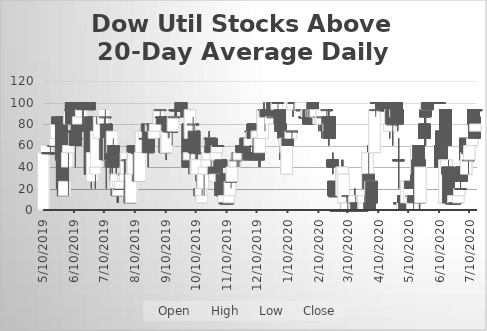
| Category | Open | High | Low | Close |
|---|---|---|---|---|
| 5/10/19 | 0.01 | 53.33 | 0.01 | 53.33 |
| 5/13/19 | 53.33 | 60 | 53.33 | 60 |
| 5/14/19 | 53.33 | 53.33 | 53.33 | 53.33 |
| 5/15/19 | 53.33 | 53.33 | 53.33 | 53.33 |
| 5/16/19 | 53.33 | 53.33 | 53.33 | 53.33 |
| 5/17/19 | 53.33 | 60 | 53.33 | 53.33 |
| 5/20/19 | 60 | 60 | 60 | 60 |
| 5/21/19 | 60 | 66.66 | 60 | 60 |
| 5/22/19 | 60 | 66.66 | 60 | 66.66 |
| 5/23/19 | 66.66 | 86.66 | 60 | 86.66 |
| 5/24/19 | 86.66 | 86.66 | 80 | 80 |
| 5/28/19 | 86.66 | 86.66 | 46.66 | 46.66 |
| 5/29/19 | 46.66 | 46.66 | 13.33 | 20 |
| 5/30/19 | 20 | 26.66 | 13.33 | 13.33 |
| 5/31/19 | 13.33 | 33.33 | 13.33 | 26.66 |
| 6/3/19 | 40 | 53.33 | 26.66 | 53.33 |
| 6/4/19 | 53.33 | 60 | 13.33 | 60 |
| 6/5/19 | 80 | 93.33 | 80 | 93.33 |
| 6/6/19 | 93.33 | 100 | 93.33 | 93.33 |
| 6/7/19 | 100 | 100 | 80 | 80 |
| 6/10/19 | 73.33 | 73.33 | 66.66 | 73.33 |
| 6/11/19 | 73.33 | 73.33 | 40 | 60 |
| 6/12/19 | 66.66 | 73.33 | 60 | 66.66 |
| 6/13/19 | 80 | 80 | 60 | 73.33 |
| 6/14/19 | 80 | 86.66 | 80 | 86.66 |
| 6/17/19 | 86.66 | 93.33 | 86.66 | 93.33 |
| 6/18/19 | 100 | 100 | 73.33 | 93.33 |
| 6/19/19 | 100 | 100 | 73.33 | 100 |
| 6/20/19 | 100 | 100 | 100 | 100 |
| 6/21/19 | 100 | 100 | 100 | 100 |
| 6/24/19 | 100 | 100 | 93.33 | 100 |
| 6/25/19 | 100 | 100 | 93.33 | 93.33 |
| 6/26/19 | 86.66 | 86.66 | 33.33 | 33.33 |
| 6/27/19 | 46.66 | 46.66 | 20 | 33.33 |
| 6/28/19 | 26.66 | 53.33 | 26.66 | 53.33 |
| 7/1/19 | 33.33 | 40 | 20 | 40 |
| 7/2/19 | 40 | 73.33 | 40 | 73.33 |
| 7/3/19 | 86.66 | 86.66 | 80 | 86.66 |
| 7/5/19 | 66.66 | 86.66 | 46.66 | 86.66 |
| 7/8/19 | 86.66 | 86.66 | 60 | 80 |
| 7/9/19 | 80 | 86.66 | 66.66 | 86.66 |
| 7/10/19 | 86.66 | 93.33 | 80 | 93.33 |
| 7/11/19 | 86.66 | 93.33 | 40 | 86.66 |
| 7/12/19 | 80 | 80 | 20 | 46.66 |
| 7/15/19 | 46.66 | 73.33 | 46.66 | 66.66 |
| 7/16/19 | 66.66 | 66.66 | 26.66 | 46.66 |
| 7/17/19 | 60 | 66.66 | 46.66 | 53.33 |
| 7/18/19 | 53.33 | 73.33 | 33.33 | 73.33 |
| 7/19/19 | 60 | 66.66 | 40 | 40 |
| 7/22/19 | 20 | 46.66 | 13.33 | 33.33 |
| 7/23/19 | 20 | 26.66 | 6.66 | 13.33 |
| 7/24/19 | 13.33 | 26.66 | 6.66 | 26.66 |
| 7/25/19 | 20 | 26.66 | 20 | 20 |
| 7/26/19 | 20 | 33.33 | 20 | 26.66 |
| 7/29/19 | 26.66 | 33.33 | 26.66 | 33.33 |
| 7/30/19 | 33.33 | 40 | 13.33 | 33.33 |
| 7/31/19 | 26.66 | 40 | 20 | 33.33 |
| 8/1/19 | 33.33 | 53.33 | 33.33 | 53.33 |
| 8/2/19 | 46.66 | 60 | 46.66 | 46.66 |
| 8/5/19 | 46.66 | 46.66 | 6.66 | 6.66 |
| 8/6/19 | 6.66 | 40 | 6.66 | 33.33 |
| 8/7/19 | 33.33 | 46.66 | 26.66 | 46.66 |
| 8/8/19 | 33.33 | 60 | 33.33 | 53.33 |
| 8/9/19 | 60 | 60 | 53.33 | 53.33 |
| 8/12/19 | 53.33 | 53.33 | 53.33 | 53.33 |
| 8/13/19 | 53.33 | 60 | 46.66 | 53.33 |
| 8/14/19 | 53.33 | 60 | 26.66 | 26.66 |
| 8/15/19 | 26.66 | 66.66 | 26.66 | 53.33 |
| 8/16/19 | 53.33 | 73.33 | 53.33 | 73.33 |
| 8/19/19 | 66.66 | 80 | 66.66 | 73.33 |
| 8/20/19 | 66.66 | 73.33 | 66.66 | 66.66 |
| 8/21/19 | 73.33 | 80 | 66.66 | 80 |
| 8/22/19 | 80 | 80 | 73.33 | 73.33 |
| 8/23/19 | 80 | 80 | 40 | 53.33 |
| 8/26/19 | 73.33 | 80 | 66.66 | 80 |
| 8/27/19 | 80 | 80 | 73.33 | 80 |
| 8/28/19 | 80 | 80 | 66.66 | 66.66 |
| 8/29/19 | 66.66 | 73.33 | 60 | 73.33 |
| 8/30/19 | 73.33 | 86.66 | 73.33 | 80 |
| 9/3/19 | 80 | 93.33 | 80 | 93.33 |
| 9/4/19 | 93.33 | 93.33 | 86.66 | 93.33 |
| 9/5/19 | 86.66 | 86.66 | 80 | 86.66 |
| 9/6/19 | 86.66 | 86.66 | 66.66 | 80 |
| 9/9/19 | 66.66 | 66.66 | 53.33 | 53.33 |
| 9/10/19 | 53.33 | 66.66 | 46.66 | 66.66 |
| 9/11/19 | 53.33 | 73.33 | 53.33 | 73.33 |
| 9/12/19 | 86.66 | 86.66 | 66.66 | 73.33 |
| 9/13/19 | 73.33 | 73.33 | 66.66 | 73.33 |
| 9/16/19 | 73.33 | 73.33 | 60 | 73.33 |
| 9/17/19 | 73.33 | 86.66 | 73.33 | 86.66 |
| 9/18/19 | 86.66 | 86.66 | 86.66 | 86.66 |
| 9/19/19 | 93.33 | 93.33 | 86.66 | 93.33 |
| 9/20/19 | 93.33 | 93.33 | 86.66 | 93.33 |
| 9/23/19 | 93.33 | 93.33 | 93.33 | 93.33 |
| 9/24/19 | 93.33 | 100 | 93.33 | 93.33 |
| 9/25/19 | 100 | 100 | 93.33 | 93.33 |
| 9/26/19 | 93.33 | 100 | 93.33 | 93.33 |
| 9/27/19 | 93.33 | 93.33 | 93.33 | 93.33 |
| 9/30/19 | 93.33 | 93.33 | 93.33 | 93.33 |
| 10/1/19 | 93.33 | 93.33 | 80 | 86.66 |
| 10/2/19 | 80 | 80 | 40 | 40 |
| 10/3/19 | 46.66 | 53.33 | 33.33 | 53.33 |
| 10/4/19 | 66.66 | 93.33 | 46.66 | 93.33 |
| 10/7/19 | 80 | 86.66 | 66.66 | 80 |
| 10/8/19 | 73.33 | 80 | 53.33 | 53.33 |
| 10/9/19 | 53.33 | 66.66 | 53.33 | 53.33 |
| 10/10/19 | 33.33 | 53.33 | 26.66 | 46.66 |
| 10/11/19 | 33.33 | 53.33 | 20 | 46.66 |
| 10/14/19 | 20 | 33.33 | 13.33 | 13.33 |
| 10/15/19 | 13.33 | 20 | 13.33 | 20 |
| 10/16/19 | 6.66 | 20 | 6.66 | 13.33 |
| 10/17/19 | 20 | 40 | 20 | 33.33 |
| 10/18/19 | 33.33 | 40 | 13.33 | 40 |
| 10/21/19 | 40 | 46.66 | 40 | 46.66 |
| 10/22/19 | 46.66 | 60 | 46.66 | 53.33 |
| 10/23/19 | 60 | 73.33 | 60 | 66.66 |
| 10/24/19 | 66.66 | 66.66 | 66.66 | 66.66 |
| 10/25/19 | 66.66 | 66.66 | 40 | 53.33 |
| 10/28/19 | 40 | 46.66 | 26.66 | 33.33 |
| 10/29/19 | 26.66 | 40 | 13.33 | 33.33 |
| 10/30/19 | 46.66 | 60 | 40 | 53.33 |
| 10/31/19 | 53.33 | 66.66 | 53.33 | 60 |
| 11/1/19 | 60 | 60 | 60 | 60 |
| 11/4/19 | 46.66 | 46.66 | 20 | 40 |
| 11/5/19 | 33.33 | 40 | 13.33 | 13.33 |
| 11/6/19 | 20 | 33.33 | 13.33 | 13.33 |
| 11/7/19 | 6.66 | 13.33 | 6.66 | 13.33 |
| 11/8/19 | 6.66 | 13.33 | 6.66 | 6.66 |
| 11/11/19 | 6.66 | 6.66 | 6.66 | 6.66 |
| 11/12/19 | 6.66 | 13.33 | 6.66 | 13.33 |
| 11/13/19 | 13.33 | 26.66 | 13.33 | 26.66 |
| 11/14/19 | 26.66 | 33.33 | 20 | 26.66 |
| 11/15/19 | 26.66 | 40 | 26.66 | 40 |
| 11/18/19 | 40 | 46.66 | 40 | 46.66 |
| 11/19/19 | 46.66 | 53.33 | 46.66 | 46.66 |
| 11/20/19 | 46.66 | 53.33 | 40 | 53.33 |
| 11/21/19 | 53.33 | 53.33 | 40 | 46.66 |
| 11/22/19 | 46.66 | 60 | 40 | 53.33 |
| 11/25/19 | 60 | 60 | 46.66 | 53.33 |
| 11/26/19 | 60 | 66.66 | 60 | 60 |
| 11/27/19 | 60 | 60 | 53.33 | 60 |
| 11/29/19 | 66.66 | 66.66 | 60 | 60 |
| 12/2/19 | 53.33 | 60 | 46.66 | 46.66 |
| 12/3/19 | 60 | 66.66 | 53.33 | 66.66 |
| 12/4/19 | 73.33 | 80 | 73.33 | 73.33 |
| 12/5/19 | 66.66 | 73.33 | 66.66 | 73.33 |
| 12/6/19 | 80 | 80 | 66.66 | 66.66 |
| 12/9/19 | 60 | 66.66 | 60 | 60 |
| 12/10/19 | 60 | 73.33 | 60 | 73.33 |
| 12/11/19 | 66.66 | 73.33 | 60 | 73.33 |
| 12/12/19 | 66.66 | 73.33 | 40 | 46.66 |
| 12/13/19 | 53.33 | 66.66 | 40 | 66.66 |
| 12/16/19 | 66.66 | 93.33 | 66.66 | 93.33 |
| 12/17/19 | 93.33 | 100 | 86.66 | 93.33 |
| 12/18/19 | 86.66 | 93.33 | 73.33 | 93.33 |
| 12/19/19 | 93.33 | 93.33 | 80 | 86.66 |
| 12/20/19 | 93.33 | 100 | 86.66 | 93.33 |
| 12/23/19 | 93.33 | 93.33 | 80 | 86.66 |
| 12/24/19 | 80 | 86.66 | 80 | 86.66 |
| 12/26/19 | 86.66 | 93.33 | 86.66 | 86.66 |
| 12/27/19 | 100 | 100 | 93.33 | 93.33 |
| 12/30/19 | 93.33 | 100 | 86.66 | 100 |
| 12/31/19 | 100 | 100 | 93.33 | 100 |
| 1/2/20 | 93.33 | 93.33 | 46.66 | 80 |
| 1/3/20 | 80 | 86.66 | 66.66 | 73.33 |
| 1/6/20 | 73.33 | 73.33 | 66.66 | 66.66 |
| 1/7/20 | 60 | 66.66 | 46.66 | 66.66 |
| 1/8/20 | 53.33 | 73.33 | 46.66 | 60 |
| 1/9/20 | 33.33 | 73.33 | 33.33 | 66.66 |
| 1/10/20 | 66.66 | 73.33 | 60 | 60 |
| 1/13/20 | 66.66 | 73.33 | 66.66 | 73.33 |
| 1/14/20 | 73.33 | 73.33 | 60 | 73.33 |
| 1/15/20 | 93.33 | 100 | 86.66 | 100 |
| 1/16/20 | 100 | 100 | 100 | 100 |
| 1/17/20 | 100 | 100 | 100 | 100 |
| 1/21/20 | 100 | 100 | 100 | 100 |
| 1/22/20 | 100 | 100 | 93.33 | 93.33 |
| 1/23/20 | 93.33 | 100 | 93.33 | 100 |
| 1/24/20 | 93.33 | 93.33 | 93.33 | 93.33 |
| 1/27/20 | 86.66 | 86.66 | 86.66 | 86.66 |
| 1/28/20 | 86.66 | 93.33 | 86.66 | 86.66 |
| 1/29/20 | 86.66 | 93.33 | 86.66 | 93.33 |
| 1/30/20 | 86.66 | 93.33 | 86.66 | 93.33 |
| 1/31/20 | 93.33 | 93.33 | 80 | 80 |
| 2/3/20 | 86.66 | 100 | 80 | 93.33 |
| 2/4/20 | 100 | 100 | 80 | 80 |
| 2/5/20 | 86.66 | 100 | 86.66 | 93.33 |
| 2/6/20 | 93.33 | 93.33 | 86.66 | 86.66 |
| 2/7/20 | 86.66 | 93.33 | 86.66 | 93.33 |
| 2/10/20 | 80 | 86.66 | 73.33 | 86.66 |
| 2/11/20 | 86.66 | 93.33 | 80 | 86.66 |
| 2/12/20 | 80 | 86.66 | 73.33 | 86.66 |
| 2/13/20 | 80 | 93.33 | 66.66 | 93.33 |
| 2/14/20 | 86.66 | 86.66 | 80 | 86.66 |
| 2/18/20 | 93.33 | 93.33 | 86.66 | 93.33 |
| 2/19/20 | 86.66 | 86.66 | 73.33 | 73.33 |
| 2/20/20 | 73.33 | 93.33 | 60 | 80 |
| 2/21/20 | 86.66 | 86.66 | 66.66 | 66.66 |
| 2/24/20 | 46.66 | 53.33 | 33.33 | 40 |
| 2/25/20 | 26.66 | 26.66 | 13.33 | 13.33 |
| 2/26/20 | 13.33 | 20 | 13.33 | 13.33 |
| 2/27/20 | 0.01 | 0.01 | 0.01 | 0.01 |
| 2/28/20 | 0.01 | 0.01 | 0.01 | 0.01 |
| 3/2/20 | 0.01 | 0.01 | 0.01 | 0.01 |
| 3/3/20 | 0.01 | 6.66 | 0.01 | 0.01 |
| 3/4/20 | 13.33 | 46.66 | 13.33 | 40 |
| 3/5/20 | 33.33 | 46.66 | 26.66 | 40 |
| 3/6/20 | 6.66 | 33.33 | 6.66 | 33.33 |
| 3/9/20 | 0.01 | 13.33 | 0.01 | 6.66 |
| 3/10/20 | 13.33 | 13.33 | 0.01 | 13.33 |
| 3/11/20 | 0.01 | 6.66 | 0.01 | 0.01 |
| 3/12/20 | 0.01 | 0.01 | 0.01 | 0.01 |
| 3/13/20 | 0.01 | 6.66 | 0.01 | 0.01 |
| 3/16/20 | 0.01 | 0.01 | 0.01 | 0.01 |
| 3/17/20 | 0.01 | 20 | 0.01 | 13.33 |
| 3/18/20 | 6.66 | 13.33 | 6.66 | 6.66 |
| 3/19/20 | 6.66 | 6.66 | 0.01 | 0.01 |
| 3/20/20 | 0.01 | 0.01 | 0.01 | 0.01 |
| 3/23/20 | 0.01 | 0.01 | 0.01 | 0.01 |
| 3/24/20 | 0.01 | 0.01 | 0.01 | 0.01 |
| 3/25/20 | 0.01 | 0.01 | 0.01 | 0.01 |
| 3/26/20 | 0.01 | 13.33 | 0.01 | 13.33 |
| 3/27/20 | 0.01 | 33.33 | 0.01 | 6.66 |
| 3/30/20 | 20 | 60 | 20 | 53.33 |
| 3/31/20 | 33.33 | 53.33 | 20 | 20 |
| 4/1/20 | 6.66 | 13.33 | 0.01 | 0.01 |
| 4/2/20 | 13.33 | 26.66 | 6.66 | 26.66 |
| 4/3/20 | 26.66 | 26.66 | 6.66 | 6.66 |
| 4/6/20 | 53.33 | 93.33 | 53.33 | 93.33 |
| 4/7/20 | 93.33 | 100 | 86.66 | 93.33 |
| 4/8/20 | 100 | 100 | 93.33 | 100 |
| 4/9/20 | 100 | 100 | 100 | 100 |
| 4/13/20 | 100 | 100 | 100 | 100 |
| 4/14/20 | 100 | 100 | 100 | 100 |
| 4/15/20 | 100 | 100 | 93.33 | 93.33 |
| 4/16/20 | 93.33 | 93.33 | 93.33 | 93.33 |
| 4/17/20 | 93.33 | 93.33 | 93.33 | 93.33 |
| 4/20/20 | 93.33 | 93.33 | 93.33 | 93.33 |
| 4/21/20 | 73.33 | 80 | 66.66 | 80 |
| 4/22/20 | 80 | 93.33 | 80 | 93.33 |
| 4/23/20 | 93.33 | 93.33 | 80 | 80 |
| 4/24/20 | 80 | 86.66 | 60 | 80 |
| 4/27/20 | 86.66 | 100 | 80 | 93.33 |
| 4/28/20 | 100 | 100 | 86.66 | 86.66 |
| 4/29/20 | 93.33 | 93.33 | 73.33 | 80 |
| 4/30/20 | 46.66 | 66.66 | 20 | 46.66 |
| 5/1/20 | 6.66 | 6.66 | 0.01 | 6.66 |
| 5/4/20 | 0.01 | 6.66 | 0.01 | 6.66 |
| 5/5/20 | 13.33 | 26.66 | 6.66 | 6.66 |
| 5/6/20 | 6.66 | 6.66 | 0.01 | 0.01 |
| 5/7/20 | 6.66 | 20 | 6.66 | 6.66 |
| 5/8/20 | 6.66 | 26.66 | 6.66 | 26.66 |
| 5/11/20 | 6.66 | 26.66 | 6.66 | 26.66 |
| 5/12/20 | 26.66 | 33.33 | 20 | 20 |
| 5/13/20 | 13.33 | 13.33 | 6.66 | 13.33 |
| 5/14/20 | 0.01 | 13.33 | 0.01 | 13.33 |
| 5/15/20 | 13.33 | 13.33 | 0.01 | 6.66 |
| 5/18/20 | 33.33 | 60 | 33.33 | 60 |
| 5/19/20 | 46.66 | 60 | 26.66 | 26.66 |
| 5/20/20 | 60 | 60 | 26.66 | 26.66 |
| 5/21/20 | 46.66 | 46.66 | 0.01 | 6.66 |
| 5/22/20 | 6.66 | 40 | 6.66 | 40 |
| 5/26/20 | 80 | 93.33 | 60 | 66.66 |
| 5/27/20 | 93.33 | 93.33 | 60 | 86.66 |
| 5/28/20 | 93.33 | 100 | 93.33 | 100 |
| 5/29/20 | 100 | 100 | 93.33 | 93.33 |
| 6/1/20 | 100 | 100 | 100 | 100 |
| 6/2/20 | 100 | 100 | 93.33 | 100 |
| 6/3/20 | 100 | 100 | 100 | 100 |
| 6/4/20 | 100 | 100 | 100 | 100 |
| 6/5/20 | 100 | 100 | 100 | 100 |
| 6/8/20 | 100 | 100 | 100 | 100 |
| 6/9/20 | 100 | 100 | 100 | 100 |
| 6/10/20 | 100 | 100 | 100 | 100 |
| 6/11/20 | 60 | 66.66 | 33.33 | 40 |
| 6/12/20 | 73.33 | 73.33 | 20 | 40 |
| 6/15/20 | 6.66 | 53.33 | 6.66 | 46.66 |
| 6/16/20 | 93.33 | 93.33 | 40 | 60 |
| 6/17/20 | 40 | 46.66 | 33.33 | 46.66 |
| 6/18/20 | 40 | 40 | 26.66 | 33.33 |
| 6/19/20 | 40 | 46.66 | 6.66 | 6.66 |
| 6/22/20 | 6.66 | 6.66 | 6.66 | 6.66 |
| 6/23/20 | 13.33 | 13.33 | 6.66 | 13.33 |
| 6/24/20 | 6.66 | 13.33 | 6.66 | 13.33 |
| 6/25/20 | 6.66 | 13.33 | 6.66 | 6.66 |
| 6/26/20 | 6.66 | 6.66 | 6.66 | 6.66 |
| 6/29/20 | 6.66 | 13.33 | 6.66 | 13.33 |
| 6/30/20 | 13.33 | 20 | 13.33 | 20 |
| 7/1/20 | 20 | 26.66 | 20 | 20 |
| 7/2/20 | 40 | 66.66 | 26.66 | 26.66 |
| 7/6/20 | 66.66 | 66.66 | 26.66 | 46.66 |
| 7/7/20 | 33.33 | 53.33 | 26.66 | 53.33 |
| 7/8/20 | 53.33 | 53.33 | 46.66 | 53.33 |
| 7/9/20 | 46.66 | 46.66 | 33.33 | 46.66 |
| 7/10/20 | 46.66 | 60 | 46.66 | 60 |
| 7/13/20 | 60 | 80 | 60 | 66.66 |
| 7/14/20 | 93.33 | 93.33 | 80 | 80 |
| 7/15/20 | 86.66 | 93.33 | 66.66 | 66.66 |
| 7/16/20 | 73.33 | 93.33 | 73.33 | 80 |
| 7/17/20 | 93.33 | 93.33 | 93.33 | 93.33 |